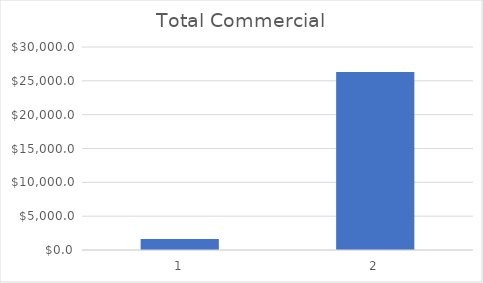
| Category | Total Commercial |
|---|---|
| 0 | 1610.557 |
| 1 | 26322.456 |